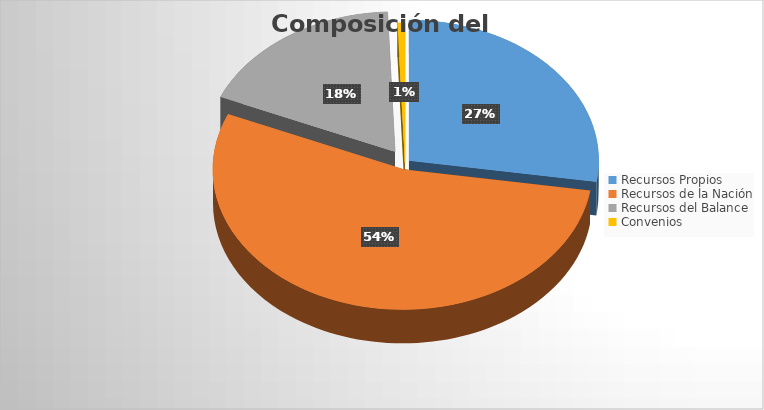
| Category | Series 0 |
|---|---|
| Recursos Propios | 48976988241.176 |
| Recursos de la Nación | 96462583539.82 |
| Recursos del Balance | 32095283336.71 |
| Convenios | 1124923529 |